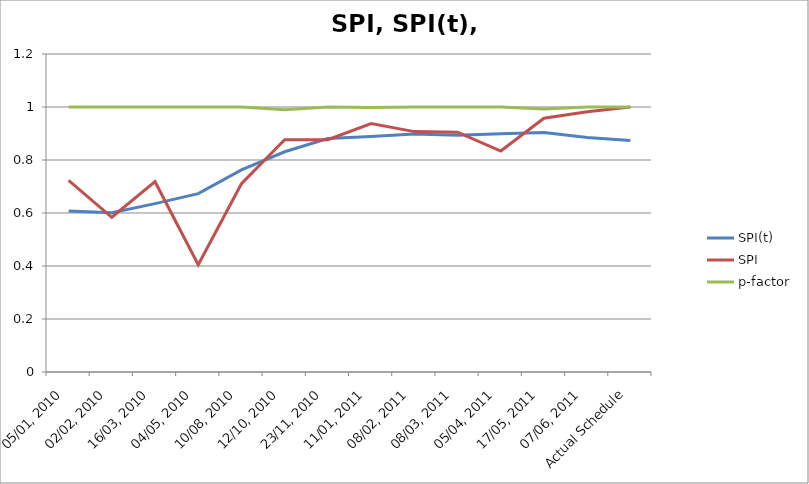
| Category | SPI(t) | SPI | p-factor |
|---|---|---|---|
| 05/01, 2010 | 0.608 | 0.723 | 1 |
| 02/02, 2010 | 0.601 | 0.584 | 1 |
| 16/03, 2010 | 0.635 | 0.718 | 1 |
| 04/05, 2010 | 0.673 | 0.405 | 1 |
| 10/08, 2010 | 0.763 | 0.71 | 1 |
| 12/10, 2010 | 0.831 | 0.877 | 0.989 |
| 23/11, 2010 | 0.881 | 0.877 | 1 |
| 11/01, 2011 | 0.889 | 0.937 | 0.999 |
| 08/02, 2011 | 0.898 | 0.907 | 1 |
| 08/03, 2011 | 0.893 | 0.905 | 1 |
| 05/04, 2011 | 0.899 | 0.834 | 1 |
| 17/05, 2011 | 0.904 | 0.958 | 0.992 |
| 07/06, 2011 | 0.885 | 0.982 | 1 |
| Actual Schedule | 0.874 | 1 | 1 |